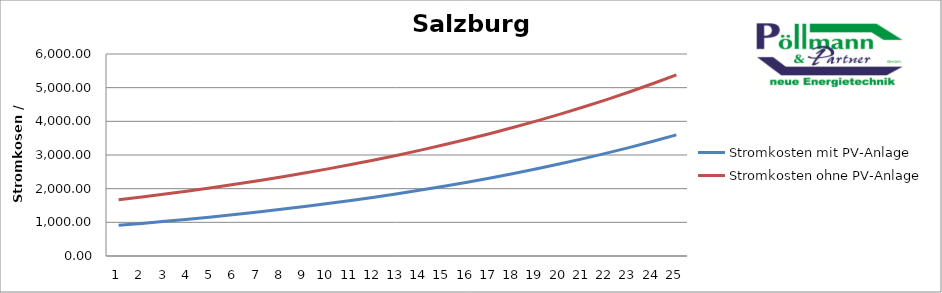
| Category | Stromkosten mit PV-Anlage | Stromkosten ohne PV-Anlage |
|---|---|---|
| 0 | 910.816 | 1667.866 |
| 1 | 968.581 | 1751.26 |
| 2 | 1029.48 | 1838.823 |
| 3 | 1093.673 | 1930.764 |
| 4 | 1161.33 | 2027.302 |
| 5 | 1232.63 | 2128.667 |
| 6 | 1307.759 | 2235.1 |
| 7 | 1386.914 | 2346.855 |
| 8 | 1470.302 | 2464.198 |
| 9 | 1558.141 | 2587.408 |
| 10 | 1650.659 | 2716.778 |
| 11 | 1748.094 | 2852.617 |
| 12 | 1850.699 | 2995.248 |
| 13 | 1958.738 | 3145.011 |
| 14 | 2072.49 | 3302.261 |
| 15 | 2192.245 | 3467.374 |
| 16 | 2318.311 | 3640.743 |
| 17 | 2451.009 | 3822.78 |
| 18 | 2590.677 | 4013.919 |
| 19 | 2737.671 | 4214.615 |
| 20 | 2892.365 | 4425.346 |
| 21 | 3055.149 | 4646.613 |
| 22 | 3226.435 | 4878.944 |
| 23 | 3406.657 | 5122.891 |
| 24 | 3596.268 | 5379.035 |